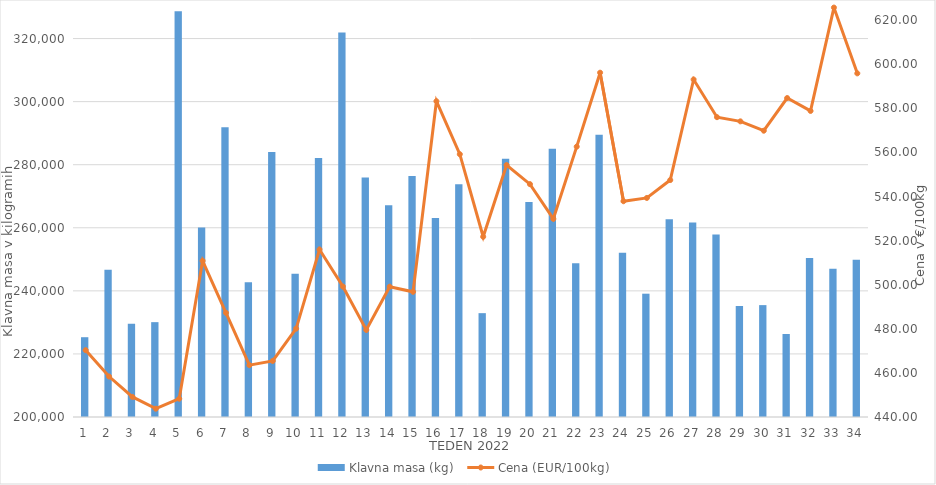
| Category | Klavna masa (kg) |
|---|---|
| 1.0 | 225300 |
| 2.0 | 246712 |
| 3.0 | 229541 |
| 4.0 | 230074 |
| 5.0 | 328640 |
| 6.0 | 260108 |
| 7.0 | 291887 |
| 8.0 | 242732 |
| 9.0 | 283987 |
| 10.0 | 245414 |
| 11.0 | 282092 |
| 12.0 | 321936 |
| 13.0 | 275950 |
| 14.0 | 267148 |
| 15.0 | 276417 |
| 16.0 | 263098 |
| 17.0 | 273824 |
| 18.0 | 232926 |
| 19.0 | 281859 |
| 20.0 | 268153 |
| 21.0 | 285073 |
| 22.0 | 248783 |
| 23.0 | 289478 |
| 24.0 | 252069 |
| 25.0 | 239099 |
| 26.0 | 262689 |
| 27.0 | 261656 |
| 28.0 | 257905 |
| 29.0 | 235185 |
| 30.0 | 235475 |
| 31.0 | 226322 |
| 32.0 | 250418 |
| 33.0 | 246996 |
| 34.0 | 249873 |